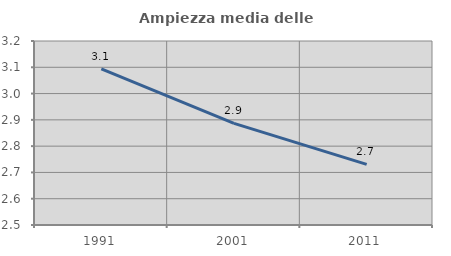
| Category | Ampiezza media delle famiglie |
|---|---|
| 1991.0 | 3.094 |
| 2001.0 | 2.887 |
| 2011.0 | 2.731 |